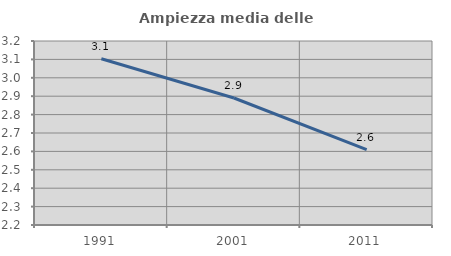
| Category | Ampiezza media delle famiglie |
|---|---|
| 1991.0 | 3.104 |
| 2001.0 | 2.89 |
| 2011.0 | 2.609 |